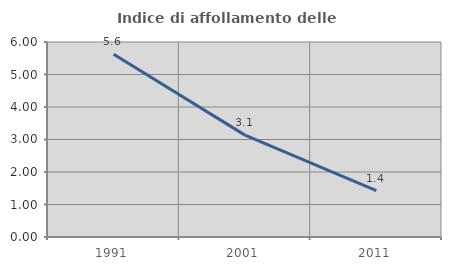
| Category | Indice di affollamento delle abitazioni  |
|---|---|
| 1991.0 | 5.626 |
| 2001.0 | 3.134 |
| 2011.0 | 1.429 |